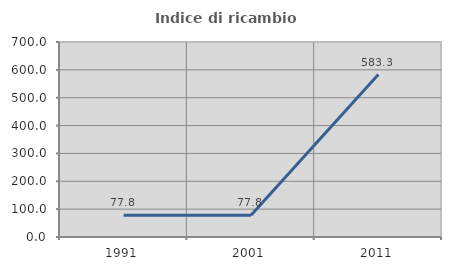
| Category | Indice di ricambio occupazionale  |
|---|---|
| 1991.0 | 77.778 |
| 2001.0 | 77.778 |
| 2011.0 | 583.333 |